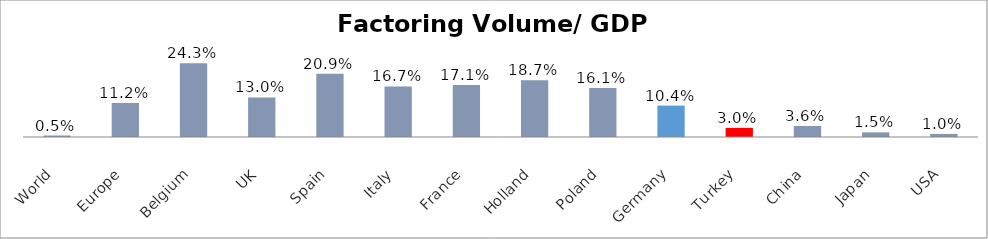
| Category | Factoring Volume/ GDP (%) |
|---|---|
| World | 0.005 |
| Europe | 0.112 |
| Belgium | 0.243 |
| UK | 0.13 |
| Spain | 0.209 |
| Italy | 0.167 |
| France | 0.171 |
| Holland | 0.187 |
| Poland | 0.161 |
| Germany | 0.104 |
| Turkey | 0.03 |
| China | 0.036 |
| Japan | 0.015 |
| USA | 0.01 |